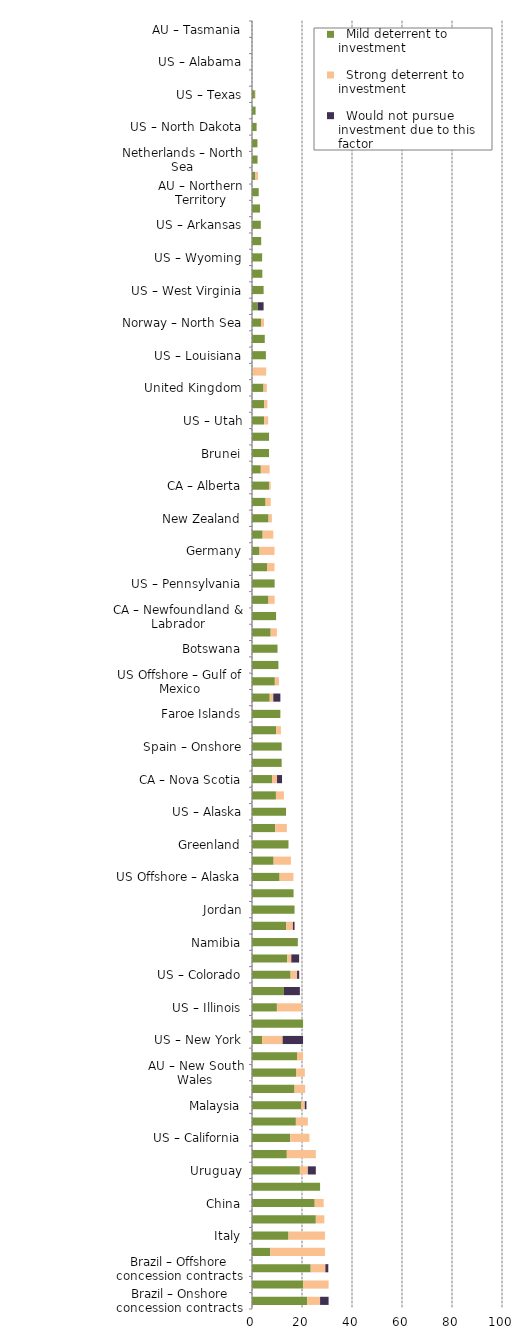
| Category |   Mild deterrent to investment |   Strong deterrent to investment |   Would not pursue investment due to this factor |
|---|---|---|---|
| Brazil – Onshore concession contracts | 22.128 | 5.106 | 3.404 |
| Israel | 20.426 | 10.213 | 0 |
| Brazil – Offshore concession contracts | 23.478 | 5.869 | 1.174 |
| US Offshore – Pacific | 7.295 | 21.884 | 0 |
| Italy | 14.59 | 14.59 | 0 |
| Turkey | 25.532 | 3.404 | 0 |
| China | 25.084 | 3.583 | 0 |
| Georgia | 27.234 | 0 | 0 |
| Uruguay | 19.149 | 3.191 | 3.191 |
| France | 13.926 | 11.605 | 0 |
| US – California | 15.319 | 7.66 | 0 |
| Brazil – Offshore presalt area profit sharing contracts | 17.553 | 4.787 | 0 |
| Malaysia | 19.745 | 1.362 | 0.681 |
| Hungary | 17.021 | 4.255 | 0 |
| AU – New South Wales | 17.608 | 3.522 | 0 |
| US – Michigan | 18.156 | 2.27 | 0 |
| US – New York | 4.085 | 8.17 | 8.17 |
| Malta | 20.426 | 0 | 0 |
| US – Illinois | 9.964 | 9.964 | 0 |
| Kuwait | 12.766 | 0 | 6.383 |
| US – Colorado | 15.448 | 2.575 | 0.858 |
| Qatar | 14.141 | 1.571 | 3.142 |
| Namibia | 18.331 | 0 | 0 |
| CA – British Columbia | 13.748 | 2.619 | 0.655 |
| Jordan | 17.021 | 0 | 0 |
| Spain – Offshore | 16.625 | 0 | 0 |
| US Offshore – Alaska | 11.041 | 5.52 | 0 |
| Oman | 8.655 | 6.924 | 0 |
| Greenland | 14.59 | 0 | 0 |
| Seychelles | 9.284 | 4.642 | 0 |
| US – Alaska | 13.617 | 0 | 0 |
| Ireland | 9.574 | 3.191 | 0 |
| CA – Nova Scotia | 8.01 | 2.003 | 2.003 |
| AU – Victoria | 11.875 | 0 | 0 |
| Spain – Onshore | 11.875 | 0 | 0 |
| AU – Queensland | 9.635 | 1.927 | 0 |
| Faroe Islands | 11.348 | 0 | 0 |
| United Arab Emirates | 7.092 | 1.418 | 2.837 |
| US Offshore – Gulf of Mexico | 9.133 | 1.661 | 0 |
| Poland | 10.565 | 0 | 0 |
| Botswana | 10.213 | 0 | 0 |
| US – New Mexico | 7.473 | 2.491 | 0 |
| CA – Newfoundland & Labrador | 9.635 | 0 | 0 |
| Australia – Offshore | 6.589 | 2.471 | 0 |
| US – Pennsylvania | 9.049 | 0 | 0 |
| Denmark | 6.008 | 3.004 | 0 |
| Germany | 3.004 | 6.008 | 0 |
| CA – Northwest Territories | 4.255 | 4.255 | 0 |
| New Zealand | 6.632 | 1.326 | 0 |
| United Kingdom – North Sea | 5.447 | 2.043 | 0 |
| CA – Alberta | 6.786 | 0.679 | 0 |
| Japan | 3.522 | 3.522 | 0 |
| Brunei | 6.809 | 0 | 0 |
| Chile | 6.809 | 0 | 0 |
| US – Utah | 4.863 | 1.621 | 0 |
| US – Montana | 4.922 | 1.23 | 0 |
| United Kingdom | 4.612 | 1.318 | 0 |
| CA – Yukon | 0 | 5.674 | 0 |
| US – Louisiana | 5.561 | 0 | 0 |
| AU – South Australia | 5.106 | 0 | 0 |
| Norway – North Sea | 3.605 | 1.202 | 0 |
| CA – Manitoba | 2.321 | 0 | 2.321 |
| US – West Virginia | 4.642 | 0 | 0 |
| US – Kansas | 4.126 | 0 | 0 |
| US – Wyoming | 4.053 | 0 | 0 |
| AU – Western Australia | 3.68 | 0 | 0 |
| US – Arkansas | 3.522 | 0 | 0 |
| US – Ohio | 3.191 | 0 | 0 |
| AU – Northern Territory | 2.688 | 0 | 0 |
| Norway | 1.216 | 1.216 | 0 |
| Netherlands – North Sea | 2.22 | 0 | 0 |
| Netherlands | 2.173 | 0 | 0 |
| US – North Dakota | 1.84 | 0 | 0 |
| US – Oklahoma | 1.438 | 0 | 0 |
| US – Texas | 1.151 | 0.288 | 0 |
| CA – Saskatchewan | 0 | 0 | 0 |
| US – Alabama | 0 | 0 | 0 |
| US – Mississippi | 0 | 0 | 0 |
| AU – Tasmania | 0 | 0 | 0 |